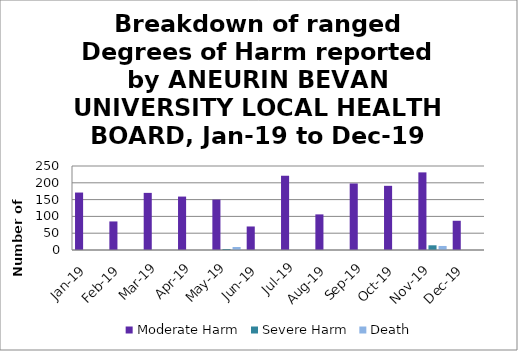
| Category | Moderate Harm | Severe Harm | Death |
|---|---|---|---|
| Jan-19 | 171 | 0 | 0 |
| Feb-19 | 85 | 0 | 0 |
| Mar-19 | 170 | 0 | 0 |
| Apr-19 | 159 | 0 | 0 |
| May-19 | 150 | 3 | 9 |
| Jun-19 | 70 | 0 | 0 |
| Jul-19 | 221 | 0 | 0 |
| Aug-19 | 106 | 0 | 0 |
| Sep-19 | 198 | 0 | 0 |
| Oct-19 | 191 | 0 | 0 |
| Nov-19 | 231 | 14 | 12 |
| Dec-19 | 87 | 0 | 0 |